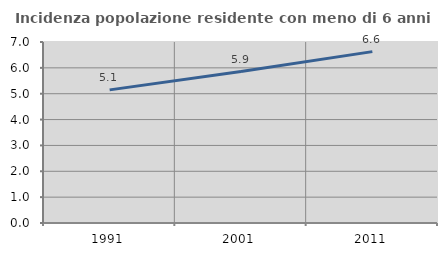
| Category | Incidenza popolazione residente con meno di 6 anni |
|---|---|
| 1991.0 | 5.149 |
| 2001.0 | 5.855 |
| 2011.0 | 6.627 |